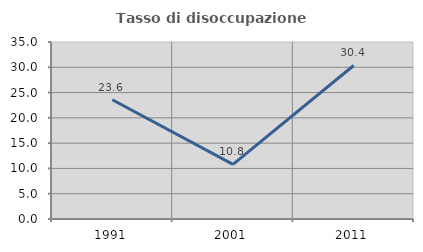
| Category | Tasso di disoccupazione giovanile  |
|---|---|
| 1991.0 | 23.577 |
| 2001.0 | 10.811 |
| 2011.0 | 30.357 |